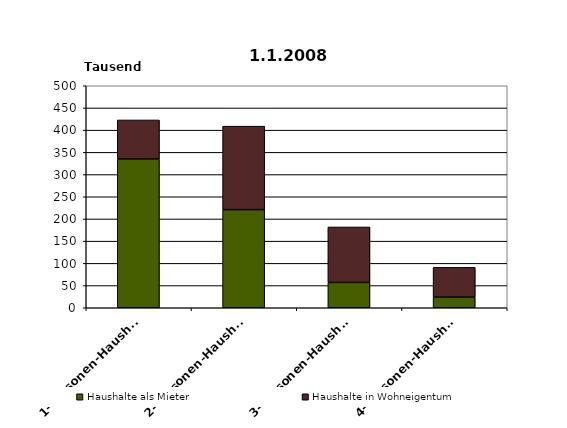
| Category | Haushalte als Mieter  | Haushalte in Wohneigentum  |
|---|---|---|
| 1-Personen-Haushalte | 335 | 88 |
| 2-Personen-Haushalte | 221 | 188 |
| 3-Personen-Haushalte | 57 | 125 |
| 4-Personen-Haushalte | 24 | 67 |